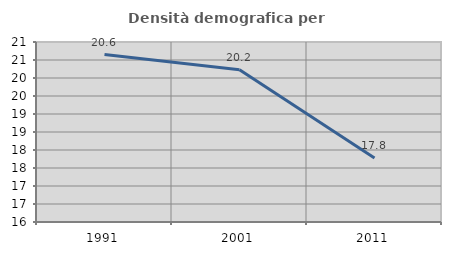
| Category | Densità demografica |
|---|---|
| 1991.0 | 20.65 |
| 2001.0 | 20.23 |
| 2011.0 | 17.78 |